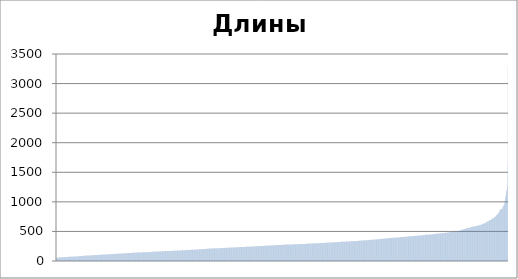
| Category | Series 0 |
|---|---|
| 0 | 37 |
| 1 | 41 |
| 2 | 43 |
| 3 | 44 |
| 4 | 49 |
| 5 | 49 |
| 6 | 50 |
| 7 | 53 |
| 8 | 57 |
| 9 | 59 |
| 10 | 59 |
| 11 | 59 |
| 12 | 59 |
| 13 | 59 |
| 14 | 59 |
| 15 | 59 |
| 16 | 59 |
| 17 | 60 |
| 18 | 60 |
| 19 | 60 |
| 20 | 60 |
| 21 | 61 |
| 22 | 61 |
| 23 | 61 |
| 24 | 61 |
| 25 | 62 |
| 26 | 62 |
| 27 | 62 |
| 28 | 62 |
| 29 | 62 |
| 30 | 63 |
| 31 | 64 |
| 32 | 64 |
| 33 | 64 |
| 34 | 64 |
| 35 | 64 |
| 36 | 64 |
| 37 | 65 |
| 38 | 65 |
| 39 | 65 |
| 40 | 65 |
| 41 | 65 |
| 42 | 65 |
| 43 | 65 |
| 44 | 65 |
| 45 | 65 |
| 46 | 66 |
| 47 | 66 |
| 48 | 66 |
| 49 | 66 |
| 50 | 66 |
| 51 | 67 |
| 52 | 67 |
| 53 | 67 |
| 54 | 67 |
| 55 | 67 |
| 56 | 67 |
| 57 | 68 |
| 58 | 68 |
| 59 | 69 |
| 60 | 69 |
| 61 | 69 |
| 62 | 69 |
| 63 | 69 |
| 64 | 70 |
| 65 | 70 |
| 66 | 70 |
| 67 | 70 |
| 68 | 70 |
| 69 | 70 |
| 70 | 70 |
| 71 | 71 |
| 72 | 71 |
| 73 | 71 |
| 74 | 71 |
| 75 | 71 |
| 76 | 71 |
| 77 | 71 |
| 78 | 72 |
| 79 | 72 |
| 80 | 72 |
| 81 | 72 |
| 82 | 72 |
| 83 | 72 |
| 84 | 72 |
| 85 | 73 |
| 86 | 73 |
| 87 | 73 |
| 88 | 73 |
| 89 | 73 |
| 90 | 74 |
| 91 | 74 |
| 92 | 74 |
| 93 | 74 |
| 94 | 75 |
| 95 | 75 |
| 96 | 75 |
| 97 | 75 |
| 98 | 76 |
| 99 | 76 |
| 100 | 76 |
| 101 | 76 |
| 102 | 76 |
| 103 | 76 |
| 104 | 76 |
| 105 | 76 |
| 106 | 76 |
| 107 | 77 |
| 108 | 77 |
| 109 | 77 |
| 110 | 77 |
| 111 | 77 |
| 112 | 78 |
| 113 | 78 |
| 114 | 78 |
| 115 | 79 |
| 116 | 79 |
| 117 | 79 |
| 118 | 79 |
| 119 | 80 |
| 120 | 80 |
| 121 | 80 |
| 122 | 80 |
| 123 | 80 |
| 124 | 80 |
| 125 | 81 |
| 126 | 81 |
| 127 | 81 |
| 128 | 82 |
| 129 | 82 |
| 130 | 82 |
| 131 | 83 |
| 132 | 83 |
| 133 | 83 |
| 134 | 83 |
| 135 | 83 |
| 136 | 84 |
| 137 | 84 |
| 138 | 85 |
| 139 | 85 |
| 140 | 85 |
| 141 | 85 |
| 142 | 86 |
| 143 | 86 |
| 144 | 86 |
| 145 | 86 |
| 146 | 86 |
| 147 | 86 |
| 148 | 87 |
| 149 | 88 |
| 150 | 88 |
| 151 | 88 |
| 152 | 88 |
| 153 | 89 |
| 154 | 89 |
| 155 | 89 |
| 156 | 89 |
| 157 | 89 |
| 158 | 89 |
| 159 | 90 |
| 160 | 90 |
| 161 | 90 |
| 162 | 91 |
| 163 | 91 |
| 164 | 91 |
| 165 | 91 |
| 166 | 91 |
| 167 | 91 |
| 168 | 91 |
| 169 | 92 |
| 170 | 92 |
| 171 | 92 |
| 172 | 92 |
| 173 | 92 |
| 174 | 93 |
| 175 | 93 |
| 176 | 93 |
| 177 | 93 |
| 178 | 93 |
| 179 | 93 |
| 180 | 93 |
| 181 | 93 |
| 182 | 94 |
| 183 | 94 |
| 184 | 94 |
| 185 | 94 |
| 186 | 94 |
| 187 | 94 |
| 188 | 95 |
| 189 | 95 |
| 190 | 96 |
| 191 | 96 |
| 192 | 96 |
| 193 | 96 |
| 194 | 96 |
| 195 | 97 |
| 196 | 98 |
| 197 | 98 |
| 198 | 98 |
| 199 | 98 |
| 200 | 98 |
| 201 | 99 |
| 202 | 99 |
| 203 | 99 |
| 204 | 99 |
| 205 | 99 |
| 206 | 99 |
| 207 | 100 |
| 208 | 100 |
| 209 | 100 |
| 210 | 100 |
| 211 | 100 |
| 212 | 101 |
| 213 | 101 |
| 214 | 101 |
| 215 | 101 |
| 216 | 101 |
| 217 | 102 |
| 218 | 102 |
| 219 | 102 |
| 220 | 102 |
| 221 | 102 |
| 222 | 103 |
| 223 | 103 |
| 224 | 103 |
| 225 | 103 |
| 226 | 103 |
| 227 | 103 |
| 228 | 103 |
| 229 | 103 |
| 230 | 103 |
| 231 | 103 |
| 232 | 103 |
| 233 | 104 |
| 234 | 104 |
| 235 | 104 |
| 236 | 105 |
| 237 | 105 |
| 238 | 105 |
| 239 | 105 |
| 240 | 105 |
| 241 | 105 |
| 242 | 105 |
| 243 | 106 |
| 244 | 106 |
| 245 | 106 |
| 246 | 106 |
| 247 | 106 |
| 248 | 107 |
| 249 | 107 |
| 250 | 107 |
| 251 | 107 |
| 252 | 107 |
| 253 | 108 |
| 254 | 108 |
| 255 | 108 |
| 256 | 108 |
| 257 | 109 |
| 258 | 109 |
| 259 | 109 |
| 260 | 109 |
| 261 | 109 |
| 262 | 109 |
| 263 | 109 |
| 264 | 110 |
| 265 | 110 |
| 266 | 110 |
| 267 | 110 |
| 268 | 111 |
| 269 | 111 |
| 270 | 111 |
| 271 | 112 |
| 272 | 112 |
| 273 | 112 |
| 274 | 112 |
| 275 | 112 |
| 276 | 112 |
| 277 | 112 |
| 278 | 113 |
| 279 | 113 |
| 280 | 114 |
| 281 | 114 |
| 282 | 114 |
| 283 | 114 |
| 284 | 114 |
| 285 | 114 |
| 286 | 114 |
| 287 | 114 |
| 288 | 115 |
| 289 | 115 |
| 290 | 115 |
| 291 | 115 |
| 292 | 115 |
| 293 | 116 |
| 294 | 116 |
| 295 | 116 |
| 296 | 116 |
| 297 | 116 |
| 298 | 116 |
| 299 | 117 |
| 300 | 117 |
| 301 | 117 |
| 302 | 117 |
| 303 | 118 |
| 304 | 118 |
| 305 | 118 |
| 306 | 118 |
| 307 | 118 |
| 308 | 118 |
| 309 | 118 |
| 310 | 119 |
| 311 | 119 |
| 312 | 119 |
| 313 | 119 |
| 314 | 119 |
| 315 | 119 |
| 316 | 119 |
| 317 | 120 |
| 318 | 120 |
| 319 | 120 |
| 320 | 120 |
| 321 | 121 |
| 322 | 121 |
| 323 | 121 |
| 324 | 121 |
| 325 | 121 |
| 326 | 121 |
| 327 | 121 |
| 328 | 121 |
| 329 | 121 |
| 330 | 122 |
| 331 | 122 |
| 332 | 122 |
| 333 | 123 |
| 334 | 123 |
| 335 | 123 |
| 336 | 123 |
| 337 | 123 |
| 338 | 124 |
| 339 | 124 |
| 340 | 124 |
| 341 | 124 |
| 342 | 124 |
| 343 | 124 |
| 344 | 125 |
| 345 | 125 |
| 346 | 126 |
| 347 | 126 |
| 348 | 126 |
| 349 | 126 |
| 350 | 126 |
| 351 | 126 |
| 352 | 126 |
| 353 | 126 |
| 354 | 126 |
| 355 | 127 |
| 356 | 127 |
| 357 | 127 |
| 358 | 127 |
| 359 | 127 |
| 360 | 128 |
| 361 | 128 |
| 362 | 129 |
| 363 | 129 |
| 364 | 130 |
| 365 | 130 |
| 366 | 130 |
| 367 | 130 |
| 368 | 130 |
| 369 | 131 |
| 370 | 131 |
| 371 | 131 |
| 372 | 131 |
| 373 | 131 |
| 374 | 132 |
| 375 | 132 |
| 376 | 132 |
| 377 | 132 |
| 378 | 132 |
| 379 | 132 |
| 380 | 133 |
| 381 | 133 |
| 382 | 133 |
| 383 | 133 |
| 384 | 134 |
| 385 | 134 |
| 386 | 134 |
| 387 | 134 |
| 388 | 134 |
| 389 | 134 |
| 390 | 134 |
| 391 | 135 |
| 392 | 135 |
| 393 | 135 |
| 394 | 135 |
| 395 | 135 |
| 396 | 135 |
| 397 | 136 |
| 398 | 136 |
| 399 | 136 |
| 400 | 136 |
| 401 | 137 |
| 402 | 137 |
| 403 | 137 |
| 404 | 137 |
| 405 | 137 |
| 406 | 137 |
| 407 | 137 |
| 408 | 137 |
| 409 | 137 |
| 410 | 137 |
| 411 | 138 |
| 412 | 138 |
| 413 | 138 |
| 414 | 139 |
| 415 | 139 |
| 416 | 139 |
| 417 | 139 |
| 418 | 140 |
| 419 | 140 |
| 420 | 140 |
| 421 | 140 |
| 422 | 140 |
| 423 | 140 |
| 424 | 140 |
| 425 | 140 |
| 426 | 140 |
| 427 | 140 |
| 428 | 141 |
| 429 | 141 |
| 430 | 141 |
| 431 | 141 |
| 432 | 141 |
| 433 | 142 |
| 434 | 142 |
| 435 | 142 |
| 436 | 142 |
| 437 | 143 |
| 438 | 143 |
| 439 | 143 |
| 440 | 143 |
| 441 | 143 |
| 442 | 143 |
| 443 | 143 |
| 444 | 143 |
| 445 | 143 |
| 446 | 143 |
| 447 | 143 |
| 448 | 144 |
| 449 | 144 |
| 450 | 144 |
| 451 | 144 |
| 452 | 145 |
| 453 | 145 |
| 454 | 145 |
| 455 | 145 |
| 456 | 145 |
| 457 | 145 |
| 458 | 145 |
| 459 | 145 |
| 460 | 145 |
| 461 | 145 |
| 462 | 145 |
| 463 | 146 |
| 464 | 146 |
| 465 | 146 |
| 466 | 146 |
| 467 | 146 |
| 468 | 146 |
| 469 | 147 |
| 470 | 147 |
| 471 | 147 |
| 472 | 147 |
| 473 | 147 |
| 474 | 147 |
| 475 | 147 |
| 476 | 148 |
| 477 | 148 |
| 478 | 148 |
| 479 | 148 |
| 480 | 148 |
| 481 | 148 |
| 482 | 148 |
| 483 | 149 |
| 484 | 149 |
| 485 | 149 |
| 486 | 149 |
| 487 | 149 |
| 488 | 149 |
| 489 | 150 |
| 490 | 150 |
| 491 | 150 |
| 492 | 150 |
| 493 | 150 |
| 494 | 150 |
| 495 | 150 |
| 496 | 150 |
| 497 | 150 |
| 498 | 150 |
| 499 | 151 |
| 500 | 151 |
| 501 | 151 |
| 502 | 151 |
| 503 | 151 |
| 504 | 151 |
| 505 | 152 |
| 506 | 152 |
| 507 | 152 |
| 508 | 152 |
| 509 | 152 |
| 510 | 153 |
| 511 | 153 |
| 512 | 153 |
| 513 | 154 |
| 514 | 154 |
| 515 | 154 |
| 516 | 154 |
| 517 | 154 |
| 518 | 155 |
| 519 | 155 |
| 520 | 155 |
| 521 | 155 |
| 522 | 155 |
| 523 | 155 |
| 524 | 155 |
| 525 | 156 |
| 526 | 156 |
| 527 | 156 |
| 528 | 156 |
| 529 | 156 |
| 530 | 156 |
| 531 | 156 |
| 532 | 157 |
| 533 | 157 |
| 534 | 157 |
| 535 | 157 |
| 536 | 157 |
| 537 | 157 |
| 538 | 158 |
| 539 | 158 |
| 540 | 158 |
| 541 | 158 |
| 542 | 158 |
| 543 | 159 |
| 544 | 159 |
| 545 | 159 |
| 546 | 159 |
| 547 | 159 |
| 548 | 159 |
| 549 | 159 |
| 550 | 159 |
| 551 | 160 |
| 552 | 160 |
| 553 | 160 |
| 554 | 160 |
| 555 | 160 |
| 556 | 161 |
| 557 | 161 |
| 558 | 161 |
| 559 | 162 |
| 560 | 162 |
| 561 | 162 |
| 562 | 162 |
| 563 | 162 |
| 564 | 162 |
| 565 | 162 |
| 566 | 163 |
| 567 | 163 |
| 568 | 163 |
| 569 | 163 |
| 570 | 163 |
| 571 | 163 |
| 572 | 163 |
| 573 | 164 |
| 574 | 164 |
| 575 | 164 |
| 576 | 164 |
| 577 | 164 |
| 578 | 165 |
| 579 | 165 |
| 580 | 165 |
| 581 | 166 |
| 582 | 166 |
| 583 | 166 |
| 584 | 166 |
| 585 | 166 |
| 586 | 166 |
| 587 | 166 |
| 588 | 166 |
| 589 | 167 |
| 590 | 167 |
| 591 | 167 |
| 592 | 167 |
| 593 | 167 |
| 594 | 167 |
| 595 | 167 |
| 596 | 167 |
| 597 | 167 |
| 598 | 167 |
| 599 | 167 |
| 600 | 168 |
| 601 | 168 |
| 602 | 168 |
| 603 | 168 |
| 604 | 168 |
| 605 | 168 |
| 606 | 169 |
| 607 | 169 |
| 608 | 169 |
| 609 | 169 |
| 610 | 169 |
| 611 | 169 |
| 612 | 170 |
| 613 | 170 |
| 614 | 170 |
| 615 | 170 |
| 616 | 170 |
| 617 | 170 |
| 618 | 171 |
| 619 | 171 |
| 620 | 171 |
| 621 | 171 |
| 622 | 171 |
| 623 | 171 |
| 624 | 171 |
| 625 | 172 |
| 626 | 172 |
| 627 | 172 |
| 628 | 172 |
| 629 | 172 |
| 630 | 172 |
| 631 | 172 |
| 632 | 172 |
| 633 | 172 |
| 634 | 172 |
| 635 | 173 |
| 636 | 173 |
| 637 | 173 |
| 638 | 173 |
| 639 | 173 |
| 640 | 173 |
| 641 | 173 |
| 642 | 174 |
| 643 | 174 |
| 644 | 174 |
| 645 | 174 |
| 646 | 174 |
| 647 | 174 |
| 648 | 174 |
| 649 | 174 |
| 650 | 174 |
| 651 | 174 |
| 652 | 175 |
| 653 | 175 |
| 654 | 175 |
| 655 | 176 |
| 656 | 176 |
| 657 | 176 |
| 658 | 176 |
| 659 | 176 |
| 660 | 176 |
| 661 | 177 |
| 662 | 177 |
| 663 | 177 |
| 664 | 177 |
| 665 | 177 |
| 666 | 177 |
| 667 | 178 |
| 668 | 178 |
| 669 | 178 |
| 670 | 178 |
| 671 | 178 |
| 672 | 178 |
| 673 | 179 |
| 674 | 179 |
| 675 | 179 |
| 676 | 179 |
| 677 | 179 |
| 678 | 180 |
| 679 | 180 |
| 680 | 180 |
| 681 | 180 |
| 682 | 180 |
| 683 | 181 |
| 684 | 181 |
| 685 | 181 |
| 686 | 181 |
| 687 | 182 |
| 688 | 182 |
| 689 | 182 |
| 690 | 182 |
| 691 | 182 |
| 692 | 182 |
| 693 | 183 |
| 694 | 183 |
| 695 | 183 |
| 696 | 183 |
| 697 | 183 |
| 698 | 183 |
| 699 | 183 |
| 700 | 183 |
| 701 | 184 |
| 702 | 184 |
| 703 | 184 |
| 704 | 185 |
| 705 | 185 |
| 706 | 185 |
| 707 | 185 |
| 708 | 185 |
| 709 | 185 |
| 710 | 185 |
| 711 | 186 |
| 712 | 186 |
| 713 | 186 |
| 714 | 186 |
| 715 | 186 |
| 716 | 186 |
| 717 | 187 |
| 718 | 187 |
| 719 | 187 |
| 720 | 187 |
| 721 | 187 |
| 722 | 187 |
| 723 | 188 |
| 724 | 188 |
| 725 | 188 |
| 726 | 188 |
| 727 | 188 |
| 728 | 188 |
| 729 | 188 |
| 730 | 188 |
| 731 | 189 |
| 732 | 189 |
| 733 | 189 |
| 734 | 189 |
| 735 | 190 |
| 736 | 190 |
| 737 | 190 |
| 738 | 191 |
| 739 | 191 |
| 740 | 191 |
| 741 | 191 |
| 742 | 191 |
| 743 | 191 |
| 744 | 191 |
| 745 | 192 |
| 746 | 192 |
| 747 | 192 |
| 748 | 192 |
| 749 | 192 |
| 750 | 193 |
| 751 | 193 |
| 752 | 193 |
| 753 | 193 |
| 754 | 193 |
| 755 | 193 |
| 756 | 193 |
| 757 | 193 |
| 758 | 194 |
| 759 | 194 |
| 760 | 194 |
| 761 | 194 |
| 762 | 194 |
| 763 | 195 |
| 764 | 195 |
| 765 | 195 |
| 766 | 196 |
| 767 | 196 |
| 768 | 196 |
| 769 | 196 |
| 770 | 197 |
| 771 | 197 |
| 772 | 197 |
| 773 | 198 |
| 774 | 198 |
| 775 | 198 |
| 776 | 198 |
| 777 | 199 |
| 778 | 199 |
| 779 | 199 |
| 780 | 199 |
| 781 | 200 |
| 782 | 200 |
| 783 | 200 |
| 784 | 200 |
| 785 | 200 |
| 786 | 200 |
| 787 | 201 |
| 788 | 201 |
| 789 | 202 |
| 790 | 202 |
| 791 | 202 |
| 792 | 202 |
| 793 | 202 |
| 794 | 203 |
| 795 | 203 |
| 796 | 203 |
| 797 | 203 |
| 798 | 204 |
| 799 | 204 |
| 800 | 204 |
| 801 | 204 |
| 802 | 204 |
| 803 | 204 |
| 804 | 204 |
| 805 | 205 |
| 806 | 205 |
| 807 | 205 |
| 808 | 205 |
| 809 | 205 |
| 810 | 205 |
| 811 | 205 |
| 812 | 206 |
| 813 | 206 |
| 814 | 206 |
| 815 | 207 |
| 816 | 207 |
| 817 | 207 |
| 818 | 207 |
| 819 | 207 |
| 820 | 207 |
| 821 | 208 |
| 822 | 208 |
| 823 | 208 |
| 824 | 208 |
| 825 | 209 |
| 826 | 210 |
| 827 | 210 |
| 828 | 210 |
| 829 | 210 |
| 830 | 210 |
| 831 | 211 |
| 832 | 211 |
| 833 | 211 |
| 834 | 211 |
| 835 | 212 |
| 836 | 212 |
| 837 | 212 |
| 838 | 212 |
| 839 | 212 |
| 840 | 212 |
| 841 | 212 |
| 842 | 212 |
| 843 | 212 |
| 844 | 212 |
| 845 | 212 |
| 846 | 212 |
| 847 | 213 |
| 848 | 213 |
| 849 | 213 |
| 850 | 213 |
| 851 | 213 |
| 852 | 213 |
| 853 | 213 |
| 854 | 213 |
| 855 | 214 |
| 856 | 214 |
| 857 | 214 |
| 858 | 214 |
| 859 | 214 |
| 860 | 214 |
| 861 | 215 |
| 862 | 215 |
| 863 | 215 |
| 864 | 215 |
| 865 | 215 |
| 866 | 215 |
| 867 | 215 |
| 868 | 215 |
| 869 | 215 |
| 870 | 215 |
| 871 | 215 |
| 872 | 215 |
| 873 | 215 |
| 874 | 216 |
| 875 | 216 |
| 876 | 216 |
| 877 | 216 |
| 878 | 216 |
| 879 | 216 |
| 880 | 216 |
| 881 | 216 |
| 882 | 216 |
| 883 | 216 |
| 884 | 216 |
| 885 | 217 |
| 886 | 217 |
| 887 | 217 |
| 888 | 217 |
| 889 | 217 |
| 890 | 217 |
| 891 | 217 |
| 892 | 217 |
| 893 | 218 |
| 894 | 218 |
| 895 | 219 |
| 896 | 219 |
| 897 | 219 |
| 898 | 219 |
| 899 | 219 |
| 900 | 219 |
| 901 | 219 |
| 902 | 219 |
| 903 | 219 |
| 904 | 219 |
| 905 | 219 |
| 906 | 219 |
| 907 | 219 |
| 908 | 220 |
| 909 | 221 |
| 910 | 221 |
| 911 | 221 |
| 912 | 221 |
| 913 | 221 |
| 914 | 222 |
| 915 | 222 |
| 916 | 222 |
| 917 | 222 |
| 918 | 223 |
| 919 | 223 |
| 920 | 223 |
| 921 | 223 |
| 922 | 223 |
| 923 | 224 |
| 924 | 224 |
| 925 | 224 |
| 926 | 224 |
| 927 | 225 |
| 928 | 225 |
| 929 | 225 |
| 930 | 225 |
| 931 | 226 |
| 932 | 226 |
| 933 | 226 |
| 934 | 226 |
| 935 | 226 |
| 936 | 226 |
| 937 | 227 |
| 938 | 227 |
| 939 | 227 |
| 940 | 227 |
| 941 | 227 |
| 942 | 228 |
| 943 | 228 |
| 944 | 228 |
| 945 | 228 |
| 946 | 228 |
| 947 | 228 |
| 948 | 228 |
| 949 | 228 |
| 950 | 229 |
| 951 | 229 |
| 952 | 229 |
| 953 | 229 |
| 954 | 229 |
| 955 | 229 |
| 956 | 229 |
| 957 | 229 |
| 958 | 229 |
| 959 | 229 |
| 960 | 229 |
| 961 | 230 |
| 962 | 230 |
| 963 | 230 |
| 964 | 230 |
| 965 | 230 |
| 966 | 230 |
| 967 | 231 |
| 968 | 231 |
| 969 | 231 |
| 970 | 231 |
| 971 | 232 |
| 972 | 232 |
| 973 | 232 |
| 974 | 233 |
| 975 | 233 |
| 976 | 233 |
| 977 | 233 |
| 978 | 233 |
| 979 | 233 |
| 980 | 234 |
| 981 | 234 |
| 982 | 234 |
| 983 | 234 |
| 984 | 234 |
| 985 | 234 |
| 986 | 234 |
| 987 | 234 |
| 988 | 234 |
| 989 | 234 |
| 990 | 234 |
| 991 | 234 |
| 992 | 234 |
| 993 | 234 |
| 994 | 235 |
| 995 | 235 |
| 996 | 235 |
| 997 | 235 |
| 998 | 235 |
| 999 | 235 |
| 1000 | 235 |
| 1001 | 235 |
| 1002 | 236 |
| 1003 | 236 |
| 1004 | 236 |
| 1005 | 236 |
| 1006 | 236 |
| 1007 | 237 |
| 1008 | 237 |
| 1009 | 237 |
| 1010 | 237 |
| 1011 | 237 |
| 1012 | 237 |
| 1013 | 238 |
| 1014 | 238 |
| 1015 | 238 |
| 1016 | 238 |
| 1017 | 238 |
| 1018 | 238 |
| 1019 | 238 |
| 1020 | 238 |
| 1021 | 238 |
| 1022 | 239 |
| 1023 | 239 |
| 1024 | 239 |
| 1025 | 239 |
| 1026 | 239 |
| 1027 | 240 |
| 1028 | 240 |
| 1029 | 240 |
| 1030 | 240 |
| 1031 | 240 |
| 1032 | 240 |
| 1033 | 240 |
| 1034 | 240 |
| 1035 | 241 |
| 1036 | 241 |
| 1037 | 241 |
| 1038 | 241 |
| 1039 | 241 |
| 1040 | 241 |
| 1041 | 241 |
| 1042 | 241 |
| 1043 | 241 |
| 1044 | 242 |
| 1045 | 242 |
| 1046 | 242 |
| 1047 | 243 |
| 1048 | 243 |
| 1049 | 243 |
| 1050 | 243 |
| 1051 | 244 |
| 1052 | 244 |
| 1053 | 244 |
| 1054 | 244 |
| 1055 | 244 |
| 1056 | 244 |
| 1057 | 244 |
| 1058 | 245 |
| 1059 | 245 |
| 1060 | 245 |
| 1061 | 245 |
| 1062 | 245 |
| 1063 | 245 |
| 1064 | 245 |
| 1065 | 246 |
| 1066 | 246 |
| 1067 | 246 |
| 1068 | 246 |
| 1069 | 246 |
| 1070 | 247 |
| 1071 | 247 |
| 1072 | 248 |
| 1073 | 248 |
| 1074 | 248 |
| 1075 | 248 |
| 1076 | 248 |
| 1077 | 249 |
| 1078 | 249 |
| 1079 | 249 |
| 1080 | 249 |
| 1081 | 249 |
| 1082 | 249 |
| 1083 | 250 |
| 1084 | 250 |
| 1085 | 250 |
| 1086 | 250 |
| 1087 | 250 |
| 1088 | 250 |
| 1089 | 250 |
| 1090 | 250 |
| 1091 | 250 |
| 1092 | 251 |
| 1093 | 251 |
| 1094 | 251 |
| 1095 | 252 |
| 1096 | 252 |
| 1097 | 252 |
| 1098 | 252 |
| 1099 | 252 |
| 1100 | 252 |
| 1101 | 252 |
| 1102 | 252 |
| 1103 | 253 |
| 1104 | 253 |
| 1105 | 253 |
| 1106 | 253 |
| 1107 | 253 |
| 1108 | 253 |
| 1109 | 253 |
| 1110 | 253 |
| 1111 | 254 |
| 1112 | 254 |
| 1113 | 254 |
| 1114 | 254 |
| 1115 | 254 |
| 1116 | 254 |
| 1117 | 255 |
| 1118 | 255 |
| 1119 | 255 |
| 1120 | 255 |
| 1121 | 255 |
| 1122 | 255 |
| 1123 | 255 |
| 1124 | 255 |
| 1125 | 256 |
| 1126 | 256 |
| 1127 | 256 |
| 1128 | 256 |
| 1129 | 256 |
| 1130 | 256 |
| 1131 | 256 |
| 1132 | 257 |
| 1133 | 257 |
| 1134 | 257 |
| 1135 | 257 |
| 1136 | 257 |
| 1137 | 258 |
| 1138 | 258 |
| 1139 | 258 |
| 1140 | 259 |
| 1141 | 259 |
| 1142 | 260 |
| 1143 | 260 |
| 1144 | 260 |
| 1145 | 261 |
| 1146 | 261 |
| 1147 | 261 |
| 1148 | 261 |
| 1149 | 261 |
| 1150 | 261 |
| 1151 | 261 |
| 1152 | 261 |
| 1153 | 261 |
| 1154 | 262 |
| 1155 | 262 |
| 1156 | 262 |
| 1157 | 262 |
| 1158 | 262 |
| 1159 | 262 |
| 1160 | 263 |
| 1161 | 263 |
| 1162 | 263 |
| 1163 | 263 |
| 1164 | 263 |
| 1165 | 263 |
| 1166 | 264 |
| 1167 | 264 |
| 1168 | 264 |
| 1169 | 264 |
| 1170 | 264 |
| 1171 | 265 |
| 1172 | 265 |
| 1173 | 265 |
| 1174 | 265 |
| 1175 | 265 |
| 1176 | 266 |
| 1177 | 266 |
| 1178 | 266 |
| 1179 | 266 |
| 1180 | 266 |
| 1181 | 267 |
| 1182 | 267 |
| 1183 | 267 |
| 1184 | 267 |
| 1185 | 267 |
| 1186 | 268 |
| 1187 | 268 |
| 1188 | 268 |
| 1189 | 268 |
| 1190 | 268 |
| 1191 | 269 |
| 1192 | 269 |
| 1193 | 269 |
| 1194 | 269 |
| 1195 | 269 |
| 1196 | 269 |
| 1197 | 269 |
| 1198 | 270 |
| 1199 | 270 |
| 1200 | 270 |
| 1201 | 270 |
| 1202 | 270 |
| 1203 | 270 |
| 1204 | 270 |
| 1205 | 270 |
| 1206 | 270 |
| 1207 | 270 |
| 1208 | 270 |
| 1209 | 271 |
| 1210 | 271 |
| 1211 | 271 |
| 1212 | 271 |
| 1213 | 271 |
| 1214 | 271 |
| 1215 | 271 |
| 1216 | 272 |
| 1217 | 272 |
| 1218 | 272 |
| 1219 | 272 |
| 1220 | 273 |
| 1221 | 273 |
| 1222 | 273 |
| 1223 | 274 |
| 1224 | 274 |
| 1225 | 274 |
| 1226 | 274 |
| 1227 | 274 |
| 1228 | 274 |
| 1229 | 275 |
| 1230 | 275 |
| 1231 | 275 |
| 1232 | 275 |
| 1233 | 276 |
| 1234 | 276 |
| 1235 | 276 |
| 1236 | 276 |
| 1237 | 276 |
| 1238 | 277 |
| 1239 | 277 |
| 1240 | 277 |
| 1241 | 277 |
| 1242 | 277 |
| 1243 | 277 |
| 1244 | 277 |
| 1245 | 278 |
| 1246 | 278 |
| 1247 | 278 |
| 1248 | 278 |
| 1249 | 278 |
| 1250 | 278 |
| 1251 | 278 |
| 1252 | 278 |
| 1253 | 278 |
| 1254 | 278 |
| 1255 | 278 |
| 1256 | 278 |
| 1257 | 279 |
| 1258 | 279 |
| 1259 | 279 |
| 1260 | 279 |
| 1261 | 279 |
| 1262 | 279 |
| 1263 | 279 |
| 1264 | 279 |
| 1265 | 279 |
| 1266 | 279 |
| 1267 | 279 |
| 1268 | 279 |
| 1269 | 279 |
| 1270 | 280 |
| 1271 | 280 |
| 1272 | 280 |
| 1273 | 280 |
| 1274 | 281 |
| 1275 | 281 |
| 1276 | 281 |
| 1277 | 281 |
| 1278 | 281 |
| 1279 | 281 |
| 1280 | 282 |
| 1281 | 282 |
| 1282 | 282 |
| 1283 | 282 |
| 1284 | 282 |
| 1285 | 282 |
| 1286 | 282 |
| 1287 | 282 |
| 1288 | 282 |
| 1289 | 282 |
| 1290 | 283 |
| 1291 | 283 |
| 1292 | 283 |
| 1293 | 283 |
| 1294 | 283 |
| 1295 | 283 |
| 1296 | 284 |
| 1297 | 284 |
| 1298 | 284 |
| 1299 | 284 |
| 1300 | 284 |
| 1301 | 284 |
| 1302 | 284 |
| 1303 | 284 |
| 1304 | 285 |
| 1305 | 285 |
| 1306 | 285 |
| 1307 | 285 |
| 1308 | 285 |
| 1309 | 285 |
| 1310 | 285 |
| 1311 | 285 |
| 1312 | 286 |
| 1313 | 286 |
| 1314 | 286 |
| 1315 | 286 |
| 1316 | 286 |
| 1317 | 286 |
| 1318 | 286 |
| 1319 | 286 |
| 1320 | 286 |
| 1321 | 287 |
| 1322 | 287 |
| 1323 | 287 |
| 1324 | 287 |
| 1325 | 287 |
| 1326 | 287 |
| 1327 | 288 |
| 1328 | 288 |
| 1329 | 288 |
| 1330 | 288 |
| 1331 | 288 |
| 1332 | 288 |
| 1333 | 288 |
| 1334 | 288 |
| 1335 | 288 |
| 1336 | 288 |
| 1337 | 288 |
| 1338 | 288 |
| 1339 | 288 |
| 1340 | 288 |
| 1341 | 289 |
| 1342 | 289 |
| 1343 | 289 |
| 1344 | 289 |
| 1345 | 289 |
| 1346 | 289 |
| 1347 | 289 |
| 1348 | 289 |
| 1349 | 289 |
| 1350 | 290 |
| 1351 | 290 |
| 1352 | 290 |
| 1353 | 290 |
| 1354 | 291 |
| 1355 | 291 |
| 1356 | 291 |
| 1357 | 291 |
| 1358 | 291 |
| 1359 | 292 |
| 1360 | 292 |
| 1361 | 292 |
| 1362 | 293 |
| 1363 | 293 |
| 1364 | 293 |
| 1365 | 293 |
| 1366 | 294 |
| 1367 | 294 |
| 1368 | 294 |
| 1369 | 294 |
| 1370 | 295 |
| 1371 | 295 |
| 1372 | 295 |
| 1373 | 295 |
| 1374 | 295 |
| 1375 | 295 |
| 1376 | 295 |
| 1377 | 295 |
| 1378 | 296 |
| 1379 | 296 |
| 1380 | 296 |
| 1381 | 296 |
| 1382 | 296 |
| 1383 | 296 |
| 1384 | 296 |
| 1385 | 296 |
| 1386 | 296 |
| 1387 | 296 |
| 1388 | 297 |
| 1389 | 297 |
| 1390 | 297 |
| 1391 | 297 |
| 1392 | 298 |
| 1393 | 298 |
| 1394 | 298 |
| 1395 | 299 |
| 1396 | 299 |
| 1397 | 299 |
| 1398 | 299 |
| 1399 | 299 |
| 1400 | 299 |
| 1401 | 299 |
| 1402 | 299 |
| 1403 | 299 |
| 1404 | 300 |
| 1405 | 300 |
| 1406 | 300 |
| 1407 | 300 |
| 1408 | 300 |
| 1409 | 300 |
| 1410 | 300 |
| 1411 | 301 |
| 1412 | 301 |
| 1413 | 301 |
| 1414 | 301 |
| 1415 | 301 |
| 1416 | 301 |
| 1417 | 302 |
| 1418 | 302 |
| 1419 | 302 |
| 1420 | 302 |
| 1421 | 302 |
| 1422 | 302 |
| 1423 | 302 |
| 1424 | 302 |
| 1425 | 303 |
| 1426 | 303 |
| 1427 | 303 |
| 1428 | 303 |
| 1429 | 303 |
| 1430 | 303 |
| 1431 | 304 |
| 1432 | 304 |
| 1433 | 304 |
| 1434 | 304 |
| 1435 | 304 |
| 1436 | 304 |
| 1437 | 304 |
| 1438 | 304 |
| 1439 | 304 |
| 1440 | 305 |
| 1441 | 305 |
| 1442 | 305 |
| 1443 | 305 |
| 1444 | 306 |
| 1445 | 306 |
| 1446 | 306 |
| 1447 | 306 |
| 1448 | 306 |
| 1449 | 307 |
| 1450 | 307 |
| 1451 | 307 |
| 1452 | 307 |
| 1453 | 307 |
| 1454 | 307 |
| 1455 | 307 |
| 1456 | 308 |
| 1457 | 308 |
| 1458 | 308 |
| 1459 | 309 |
| 1460 | 309 |
| 1461 | 309 |
| 1462 | 309 |
| 1463 | 309 |
| 1464 | 309 |
| 1465 | 309 |
| 1466 | 310 |
| 1467 | 310 |
| 1468 | 310 |
| 1469 | 311 |
| 1470 | 311 |
| 1471 | 311 |
| 1472 | 312 |
| 1473 | 312 |
| 1474 | 312 |
| 1475 | 312 |
| 1476 | 312 |
| 1477 | 312 |
| 1478 | 312 |
| 1479 | 313 |
| 1480 | 313 |
| 1481 | 313 |
| 1482 | 313 |
| 1483 | 313 |
| 1484 | 314 |
| 1485 | 314 |
| 1486 | 314 |
| 1487 | 314 |
| 1488 | 314 |
| 1489 | 314 |
| 1490 | 314 |
| 1491 | 314 |
| 1492 | 314 |
| 1493 | 314 |
| 1494 | 315 |
| 1495 | 315 |
| 1496 | 316 |
| 1497 | 316 |
| 1498 | 316 |
| 1499 | 317 |
| 1500 | 317 |
| 1501 | 317 |
| 1502 | 317 |
| 1503 | 317 |
| 1504 | 317 |
| 1505 | 317 |
| 1506 | 318 |
| 1507 | 318 |
| 1508 | 318 |
| 1509 | 318 |
| 1510 | 318 |
| 1511 | 318 |
| 1512 | 319 |
| 1513 | 319 |
| 1514 | 319 |
| 1515 | 319 |
| 1516 | 319 |
| 1517 | 319 |
| 1518 | 319 |
| 1519 | 319 |
| 1520 | 319 |
| 1521 | 320 |
| 1522 | 320 |
| 1523 | 320 |
| 1524 | 321 |
| 1525 | 321 |
| 1526 | 321 |
| 1527 | 321 |
| 1528 | 321 |
| 1529 | 321 |
| 1530 | 322 |
| 1531 | 322 |
| 1532 | 322 |
| 1533 | 322 |
| 1534 | 322 |
| 1535 | 322 |
| 1536 | 323 |
| 1537 | 323 |
| 1538 | 323 |
| 1539 | 323 |
| 1540 | 324 |
| 1541 | 324 |
| 1542 | 324 |
| 1543 | 324 |
| 1544 | 324 |
| 1545 | 324 |
| 1546 | 324 |
| 1547 | 324 |
| 1548 | 325 |
| 1549 | 325 |
| 1550 | 325 |
| 1551 | 325 |
| 1552 | 325 |
| 1553 | 325 |
| 1554 | 325 |
| 1555 | 326 |
| 1556 | 326 |
| 1557 | 326 |
| 1558 | 326 |
| 1559 | 326 |
| 1560 | 326 |
| 1561 | 326 |
| 1562 | 326 |
| 1563 | 326 |
| 1564 | 327 |
| 1565 | 327 |
| 1566 | 327 |
| 1567 | 328 |
| 1568 | 328 |
| 1569 | 328 |
| 1570 | 328 |
| 1571 | 328 |
| 1572 | 329 |
| 1573 | 329 |
| 1574 | 329 |
| 1575 | 329 |
| 1576 | 329 |
| 1577 | 329 |
| 1578 | 329 |
| 1579 | 329 |
| 1580 | 329 |
| 1581 | 330 |
| 1582 | 330 |
| 1583 | 330 |
| 1584 | 330 |
| 1585 | 330 |
| 1586 | 331 |
| 1587 | 331 |
| 1588 | 331 |
| 1589 | 331 |
| 1590 | 331 |
| 1591 | 332 |
| 1592 | 332 |
| 1593 | 332 |
| 1594 | 332 |
| 1595 | 332 |
| 1596 | 333 |
| 1597 | 333 |
| 1598 | 333 |
| 1599 | 333 |
| 1600 | 333 |
| 1601 | 333 |
| 1602 | 334 |
| 1603 | 334 |
| 1604 | 334 |
| 1605 | 334 |
| 1606 | 334 |
| 1607 | 334 |
| 1608 | 334 |
| 1609 | 335 |
| 1610 | 335 |
| 1611 | 335 |
| 1612 | 336 |
| 1613 | 336 |
| 1614 | 336 |
| 1615 | 336 |
| 1616 | 337 |
| 1617 | 337 |
| 1618 | 337 |
| 1619 | 337 |
| 1620 | 337 |
| 1621 | 337 |
| 1622 | 337 |
| 1623 | 337 |
| 1624 | 338 |
| 1625 | 338 |
| 1626 | 338 |
| 1627 | 338 |
| 1628 | 338 |
| 1629 | 339 |
| 1630 | 339 |
| 1631 | 339 |
| 1632 | 340 |
| 1633 | 340 |
| 1634 | 340 |
| 1635 | 341 |
| 1636 | 341 |
| 1637 | 341 |
| 1638 | 342 |
| 1639 | 343 |
| 1640 | 344 |
| 1641 | 344 |
| 1642 | 344 |
| 1643 | 344 |
| 1644 | 344 |
| 1645 | 344 |
| 1646 | 345 |
| 1647 | 345 |
| 1648 | 345 |
| 1649 | 345 |
| 1650 | 346 |
| 1651 | 346 |
| 1652 | 346 |
| 1653 | 346 |
| 1654 | 346 |
| 1655 | 346 |
| 1656 | 347 |
| 1657 | 347 |
| 1658 | 347 |
| 1659 | 347 |
| 1660 | 347 |
| 1661 | 348 |
| 1662 | 348 |
| 1663 | 348 |
| 1664 | 348 |
| 1665 | 348 |
| 1666 | 348 |
| 1667 | 349 |
| 1668 | 349 |
| 1669 | 349 |
| 1670 | 349 |
| 1671 | 349 |
| 1672 | 349 |
| 1673 | 350 |
| 1674 | 350 |
| 1675 | 350 |
| 1676 | 351 |
| 1677 | 351 |
| 1678 | 351 |
| 1679 | 351 |
| 1680 | 352 |
| 1681 | 352 |
| 1682 | 352 |
| 1683 | 352 |
| 1684 | 352 |
| 1685 | 353 |
| 1686 | 353 |
| 1687 | 354 |
| 1688 | 354 |
| 1689 | 355 |
| 1690 | 355 |
| 1691 | 355 |
| 1692 | 355 |
| 1693 | 355 |
| 1694 | 355 |
| 1695 | 356 |
| 1696 | 356 |
| 1697 | 357 |
| 1698 | 357 |
| 1699 | 357 |
| 1700 | 358 |
| 1701 | 358 |
| 1702 | 358 |
| 1703 | 358 |
| 1704 | 359 |
| 1705 | 359 |
| 1706 | 359 |
| 1707 | 359 |
| 1708 | 360 |
| 1709 | 360 |
| 1710 | 360 |
| 1711 | 361 |
| 1712 | 361 |
| 1713 | 361 |
| 1714 | 361 |
| 1715 | 361 |
| 1716 | 361 |
| 1717 | 362 |
| 1718 | 362 |
| 1719 | 362 |
| 1720 | 362 |
| 1721 | 363 |
| 1722 | 363 |
| 1723 | 363 |
| 1724 | 363 |
| 1725 | 364 |
| 1726 | 364 |
| 1727 | 364 |
| 1728 | 364 |
| 1729 | 364 |
| 1730 | 365 |
| 1731 | 365 |
| 1732 | 365 |
| 1733 | 365 |
| 1734 | 366 |
| 1735 | 366 |
| 1736 | 366 |
| 1737 | 367 |
| 1738 | 367 |
| 1739 | 368 |
| 1740 | 368 |
| 1741 | 368 |
| 1742 | 368 |
| 1743 | 369 |
| 1744 | 369 |
| 1745 | 369 |
| 1746 | 369 |
| 1747 | 369 |
| 1748 | 370 |
| 1749 | 370 |
| 1750 | 370 |
| 1751 | 371 |
| 1752 | 371 |
| 1753 | 372 |
| 1754 | 373 |
| 1755 | 373 |
| 1756 | 373 |
| 1757 | 373 |
| 1758 | 373 |
| 1759 | 374 |
| 1760 | 374 |
| 1761 | 374 |
| 1762 | 374 |
| 1763 | 376 |
| 1764 | 376 |
| 1765 | 376 |
| 1766 | 376 |
| 1767 | 376 |
| 1768 | 377 |
| 1769 | 377 |
| 1770 | 378 |
| 1771 | 378 |
| 1772 | 379 |
| 1773 | 379 |
| 1774 | 379 |
| 1775 | 380 |
| 1776 | 380 |
| 1777 | 380 |
| 1778 | 381 |
| 1779 | 381 |
| 1780 | 381 |
| 1781 | 381 |
| 1782 | 382 |
| 1783 | 382 |
| 1784 | 382 |
| 1785 | 382 |
| 1786 | 382 |
| 1787 | 382 |
| 1788 | 383 |
| 1789 | 383 |
| 1790 | 383 |
| 1791 | 383 |
| 1792 | 384 |
| 1793 | 385 |
| 1794 | 385 |
| 1795 | 385 |
| 1796 | 385 |
| 1797 | 386 |
| 1798 | 386 |
| 1799 | 386 |
| 1800 | 386 |
| 1801 | 387 |
| 1802 | 388 |
| 1803 | 388 |
| 1804 | 388 |
| 1805 | 388 |
| 1806 | 389 |
| 1807 | 389 |
| 1808 | 389 |
| 1809 | 389 |
| 1810 | 390 |
| 1811 | 390 |
| 1812 | 390 |
| 1813 | 390 |
| 1814 | 391 |
| 1815 | 391 |
| 1816 | 391 |
| 1817 | 391 |
| 1818 | 392 |
| 1819 | 392 |
| 1820 | 392 |
| 1821 | 392 |
| 1822 | 392 |
| 1823 | 393 |
| 1824 | 393 |
| 1825 | 393 |
| 1826 | 393 |
| 1827 | 393 |
| 1828 | 393 |
| 1829 | 393 |
| 1830 | 394 |
| 1831 | 394 |
| 1832 | 394 |
| 1833 | 394 |
| 1834 | 394 |
| 1835 | 394 |
| 1836 | 394 |
| 1837 | 395 |
| 1838 | 395 |
| 1839 | 395 |
| 1840 | 395 |
| 1841 | 396 |
| 1842 | 396 |
| 1843 | 396 |
| 1844 | 396 |
| 1845 | 396 |
| 1846 | 396 |
| 1847 | 396 |
| 1848 | 397 |
| 1849 | 397 |
| 1850 | 397 |
| 1851 | 398 |
| 1852 | 398 |
| 1853 | 399 |
| 1854 | 399 |
| 1855 | 399 |
| 1856 | 399 |
| 1857 | 401 |
| 1858 | 401 |
| 1859 | 401 |
| 1860 | 401 |
| 1861 | 402 |
| 1862 | 403 |
| 1863 | 403 |
| 1864 | 403 |
| 1865 | 403 |
| 1866 | 404 |
| 1867 | 404 |
| 1868 | 404 |
| 1869 | 404 |
| 1870 | 404 |
| 1871 | 405 |
| 1872 | 405 |
| 1873 | 405 |
| 1874 | 405 |
| 1875 | 405 |
| 1876 | 405 |
| 1877 | 406 |
| 1878 | 406 |
| 1879 | 406 |
| 1880 | 407 |
| 1881 | 407 |
| 1882 | 408 |
| 1883 | 408 |
| 1884 | 408 |
| 1885 | 408 |
| 1886 | 409 |
| 1887 | 409 |
| 1888 | 409 |
| 1889 | 410 |
| 1890 | 411 |
| 1891 | 411 |
| 1892 | 411 |
| 1893 | 411 |
| 1894 | 411 |
| 1895 | 411 |
| 1896 | 412 |
| 1897 | 412 |
| 1898 | 412 |
| 1899 | 413 |
| 1900 | 413 |
| 1901 | 413 |
| 1902 | 414 |
| 1903 | 414 |
| 1904 | 414 |
| 1905 | 415 |
| 1906 | 415 |
| 1907 | 415 |
| 1908 | 416 |
| 1909 | 416 |
| 1910 | 416 |
| 1911 | 416 |
| 1912 | 417 |
| 1913 | 418 |
| 1914 | 418 |
| 1915 | 418 |
| 1916 | 418 |
| 1917 | 418 |
| 1918 | 419 |
| 1919 | 419 |
| 1920 | 419 |
| 1921 | 419 |
| 1922 | 420 |
| 1923 | 420 |
| 1924 | 420 |
| 1925 | 420 |
| 1926 | 420 |
| 1927 | 420 |
| 1928 | 420 |
| 1929 | 421 |
| 1930 | 421 |
| 1931 | 421 |
| 1932 | 421 |
| 1933 | 421 |
| 1934 | 422 |
| 1935 | 423 |
| 1936 | 423 |
| 1937 | 423 |
| 1938 | 423 |
| 1939 | 423 |
| 1940 | 424 |
| 1941 | 424 |
| 1942 | 425 |
| 1943 | 425 |
| 1944 | 425 |
| 1945 | 426 |
| 1946 | 426 |
| 1947 | 427 |
| 1948 | 427 |
| 1949 | 427 |
| 1950 | 427 |
| 1951 | 427 |
| 1952 | 428 |
| 1953 | 428 |
| 1954 | 428 |
| 1955 | 429 |
| 1956 | 430 |
| 1957 | 430 |
| 1958 | 430 |
| 1959 | 430 |
| 1960 | 430 |
| 1961 | 431 |
| 1962 | 431 |
| 1963 | 431 |
| 1964 | 431 |
| 1965 | 431 |
| 1966 | 432 |
| 1967 | 432 |
| 1968 | 432 |
| 1969 | 432 |
| 1970 | 432 |
| 1971 | 432 |
| 1972 | 432 |
| 1973 | 433 |
| 1974 | 433 |
| 1975 | 433 |
| 1976 | 433 |
| 1977 | 435 |
| 1978 | 435 |
| 1979 | 436 |
| 1980 | 436 |
| 1981 | 436 |
| 1982 | 436 |
| 1983 | 436 |
| 1984 | 437 |
| 1985 | 437 |
| 1986 | 437 |
| 1987 | 438 |
| 1988 | 438 |
| 1989 | 438 |
| 1990 | 439 |
| 1991 | 439 |
| 1992 | 439 |
| 1993 | 440 |
| 1994 | 440 |
| 1995 | 440 |
| 1996 | 441 |
| 1997 | 441 |
| 1998 | 442 |
| 1999 | 442 |
| 2000 | 442 |
| 2001 | 442 |
| 2002 | 443 |
| 2003 | 443 |
| 2004 | 443 |
| 2005 | 443 |
| 2006 | 443 |
| 2007 | 444 |
| 2008 | 444 |
| 2009 | 444 |
| 2010 | 445 |
| 2011 | 445 |
| 2012 | 445 |
| 2013 | 445 |
| 2014 | 445 |
| 2015 | 445 |
| 2016 | 446 |
| 2017 | 446 |
| 2018 | 447 |
| 2019 | 447 |
| 2020 | 447 |
| 2021 | 447 |
| 2022 | 448 |
| 2023 | 448 |
| 2024 | 448 |
| 2025 | 449 |
| 2026 | 449 |
| 2027 | 449 |
| 2028 | 449 |
| 2029 | 450 |
| 2030 | 450 |
| 2031 | 450 |
| 2032 | 450 |
| 2033 | 451 |
| 2034 | 451 |
| 2035 | 452 |
| 2036 | 452 |
| 2037 | 452 |
| 2038 | 452 |
| 2039 | 453 |
| 2040 | 454 |
| 2041 | 454 |
| 2042 | 455 |
| 2043 | 455 |
| 2044 | 455 |
| 2045 | 456 |
| 2046 | 456 |
| 2047 | 457 |
| 2048 | 457 |
| 2049 | 458 |
| 2050 | 458 |
| 2051 | 458 |
| 2052 | 458 |
| 2053 | 458 |
| 2054 | 459 |
| 2055 | 459 |
| 2056 | 460 |
| 2057 | 461 |
| 2058 | 461 |
| 2059 | 461 |
| 2060 | 462 |
| 2061 | 462 |
| 2062 | 463 |
| 2063 | 463 |
| 2064 | 463 |
| 2065 | 463 |
| 2066 | 463 |
| 2067 | 463 |
| 2068 | 464 |
| 2069 | 464 |
| 2070 | 464 |
| 2071 | 465 |
| 2072 | 466 |
| 2073 | 467 |
| 2074 | 467 |
| 2075 | 467 |
| 2076 | 467 |
| 2077 | 467 |
| 2078 | 468 |
| 2079 | 468 |
| 2080 | 468 |
| 2081 | 469 |
| 2082 | 469 |
| 2083 | 470 |
| 2084 | 470 |
| 2085 | 470 |
| 2086 | 470 |
| 2087 | 471 |
| 2088 | 471 |
| 2089 | 471 |
| 2090 | 471 |
| 2091 | 472 |
| 2092 | 472 |
| 2093 | 472 |
| 2094 | 472 |
| 2095 | 473 |
| 2096 | 473 |
| 2097 | 473 |
| 2098 | 473 |
| 2099 | 474 |
| 2100 | 474 |
| 2101 | 474 |
| 2102 | 475 |
| 2103 | 475 |
| 2104 | 476 |
| 2105 | 476 |
| 2106 | 476 |
| 2107 | 476 |
| 2108 | 477 |
| 2109 | 477 |
| 2110 | 477 |
| 2111 | 477 |
| 2112 | 478 |
| 2113 | 480 |
| 2114 | 481 |
| 2115 | 482 |
| 2116 | 482 |
| 2117 | 483 |
| 2118 | 483 |
| 2119 | 483 |
| 2120 | 483 |
| 2121 | 484 |
| 2122 | 484 |
| 2123 | 485 |
| 2124 | 486 |
| 2125 | 486 |
| 2126 | 486 |
| 2127 | 486 |
| 2128 | 487 |
| 2129 | 487 |
| 2130 | 487 |
| 2131 | 488 |
| 2132 | 488 |
| 2133 | 489 |
| 2134 | 489 |
| 2135 | 490 |
| 2136 | 491 |
| 2137 | 491 |
| 2138 | 491 |
| 2139 | 492 |
| 2140 | 492 |
| 2141 | 492 |
| 2142 | 493 |
| 2143 | 493 |
| 2144 | 493 |
| 2145 | 495 |
| 2146 | 496 |
| 2147 | 496 |
| 2148 | 497 |
| 2149 | 497 |
| 2150 | 497 |
| 2151 | 497 |
| 2152 | 497 |
| 2153 | 498 |
| 2154 | 498 |
| 2155 | 499 |
| 2156 | 499 |
| 2157 | 499 |
| 2158 | 501 |
| 2159 | 501 |
| 2160 | 501 |
| 2161 | 502 |
| 2162 | 502 |
| 2163 | 503 |
| 2164 | 503 |
| 2165 | 504 |
| 2166 | 504 |
| 2167 | 505 |
| 2168 | 505 |
| 2169 | 505 |
| 2170 | 506 |
| 2171 | 506 |
| 2172 | 506 |
| 2173 | 506 |
| 2174 | 509 |
| 2175 | 509 |
| 2176 | 509 |
| 2177 | 509 |
| 2178 | 511 |
| 2179 | 511 |
| 2180 | 512 |
| 2181 | 512 |
| 2182 | 513 |
| 2183 | 513 |
| 2184 | 514 |
| 2185 | 514 |
| 2186 | 515 |
| 2187 | 516 |
| 2188 | 516 |
| 2189 | 519 |
| 2190 | 524 |
| 2191 | 525 |
| 2192 | 525 |
| 2193 | 527 |
| 2194 | 528 |
| 2195 | 528 |
| 2196 | 528 |
| 2197 | 532 |
| 2198 | 532 |
| 2199 | 532 |
| 2200 | 534 |
| 2201 | 535 |
| 2202 | 535 |
| 2203 | 535 |
| 2204 | 536 |
| 2205 | 539 |
| 2206 | 539 |
| 2207 | 539 |
| 2208 | 541 |
| 2209 | 542 |
| 2210 | 542 |
| 2211 | 545 |
| 2212 | 546 |
| 2213 | 546 |
| 2214 | 547 |
| 2215 | 547 |
| 2216 | 547 |
| 2217 | 548 |
| 2218 | 548 |
| 2219 | 550 |
| 2220 | 551 |
| 2221 | 552 |
| 2222 | 552 |
| 2223 | 553 |
| 2224 | 554 |
| 2225 | 554 |
| 2226 | 556 |
| 2227 | 556 |
| 2228 | 557 |
| 2229 | 557 |
| 2230 | 557 |
| 2231 | 558 |
| 2232 | 558 |
| 2233 | 559 |
| 2234 | 559 |
| 2235 | 561 |
| 2236 | 564 |
| 2237 | 564 |
| 2238 | 568 |
| 2239 | 568 |
| 2240 | 568 |
| 2241 | 569 |
| 2242 | 571 |
| 2243 | 572 |
| 2244 | 573 |
| 2245 | 573 |
| 2246 | 573 |
| 2247 | 573 |
| 2248 | 573 |
| 2249 | 574 |
| 2250 | 575 |
| 2251 | 576 |
| 2252 | 578 |
| 2253 | 580 |
| 2254 | 582 |
| 2255 | 583 |
| 2256 | 584 |
| 2257 | 584 |
| 2258 | 585 |
| 2259 | 585 |
| 2260 | 585 |
| 2261 | 586 |
| 2262 | 586 |
| 2263 | 587 |
| 2264 | 589 |
| 2265 | 589 |
| 2266 | 589 |
| 2267 | 589 |
| 2268 | 589 |
| 2269 | 590 |
| 2270 | 591 |
| 2271 | 591 |
| 2272 | 592 |
| 2273 | 593 |
| 2274 | 593 |
| 2275 | 593 |
| 2276 | 594 |
| 2277 | 594 |
| 2278 | 596 |
| 2279 | 598 |
| 2280 | 599 |
| 2281 | 600 |
| 2282 | 602 |
| 2283 | 602 |
| 2284 | 603 |
| 2285 | 603 |
| 2286 | 604 |
| 2287 | 604 |
| 2288 | 604 |
| 2289 | 604 |
| 2290 | 605 |
| 2291 | 606 |
| 2292 | 607 |
| 2293 | 607 |
| 2294 | 607 |
| 2295 | 609 |
| 2296 | 611 |
| 2297 | 612 |
| 2298 | 612 |
| 2299 | 613 |
| 2300 | 614 |
| 2301 | 617 |
| 2302 | 618 |
| 2303 | 619 |
| 2304 | 620 |
| 2305 | 621 |
| 2306 | 626 |
| 2307 | 628 |
| 2308 | 630 |
| 2309 | 631 |
| 2310 | 631 |
| 2311 | 632 |
| 2312 | 633 |
| 2313 | 633 |
| 2314 | 634 |
| 2315 | 635 |
| 2316 | 635 |
| 2317 | 635 |
| 2318 | 636 |
| 2319 | 640 |
| 2320 | 641 |
| 2321 | 645 |
| 2322 | 645 |
| 2323 | 645 |
| 2324 | 648 |
| 2325 | 652 |
| 2326 | 653 |
| 2327 | 660 |
| 2328 | 663 |
| 2329 | 664 |
| 2330 | 664 |
| 2331 | 664 |
| 2332 | 666 |
| 2333 | 666 |
| 2334 | 669 |
| 2335 | 670 |
| 2336 | 673 |
| 2337 | 674 |
| 2338 | 676 |
| 2339 | 680 |
| 2340 | 681 |
| 2341 | 682 |
| 2342 | 684 |
| 2343 | 687 |
| 2344 | 690 |
| 2345 | 691 |
| 2346 | 693 |
| 2347 | 693 |
| 2348 | 694 |
| 2349 | 695 |
| 2350 | 695 |
| 2351 | 699 |
| 2352 | 701 |
| 2353 | 701 |
| 2354 | 702 |
| 2355 | 706 |
| 2356 | 712 |
| 2357 | 714 |
| 2358 | 714 |
| 2359 | 715 |
| 2360 | 717 |
| 2361 | 718 |
| 2362 | 719 |
| 2363 | 721 |
| 2364 | 725 |
| 2365 | 725 |
| 2366 | 727 |
| 2367 | 730 |
| 2368 | 734 |
| 2369 | 736 |
| 2370 | 738 |
| 2371 | 742 |
| 2372 | 742 |
| 2373 | 743 |
| 2374 | 747 |
| 2375 | 748 |
| 2376 | 752 |
| 2377 | 757 |
| 2378 | 761 |
| 2379 | 763 |
| 2380 | 763 |
| 2381 | 772 |
| 2382 | 779 |
| 2383 | 782 |
| 2384 | 785 |
| 2385 | 787 |
| 2386 | 788 |
| 2387 | 791 |
| 2388 | 793 |
| 2389 | 799 |
| 2390 | 805 |
| 2391 | 805 |
| 2392 | 805 |
| 2393 | 811 |
| 2394 | 827 |
| 2395 | 830 |
| 2396 | 833 |
| 2397 | 842 |
| 2398 | 849 |
| 2399 | 859 |
| 2400 | 862 |
| 2401 | 862 |
| 2402 | 869 |
| 2403 | 870 |
| 2404 | 871 |
| 2405 | 874 |
| 2406 | 874 |
| 2407 | 876 |
| 2408 | 878 |
| 2409 | 880 |
| 2410 | 881 |
| 2411 | 882 |
| 2412 | 884 |
| 2413 | 886 |
| 2414 | 890 |
| 2415 | 915 |
| 2416 | 924 |
| 2417 | 929 |
| 2418 | 937 |
| 2419 | 940 |
| 2420 | 940 |
| 2421 | 946 |
| 2422 | 946 |
| 2423 | 954 |
| 2424 | 964 |
| 2425 | 999 |
| 2426 | 1015 |
| 2427 | 1019 |
| 2428 | 1059 |
| 2429 | 1075 |
| 2430 | 1090 |
| 2431 | 1112 |
| 2432 | 1113 |
| 2433 | 1143 |
| 2434 | 1173 |
| 2435 | 1188 |
| 2436 | 1190 |
| 2437 | 1206 |
| 2438 | 1206 |
| 2439 | 1255 |
| 2440 | 1267 |
| 2441 | 1446 |
| 2442 | 1675 |
| 2443 | 3309 |